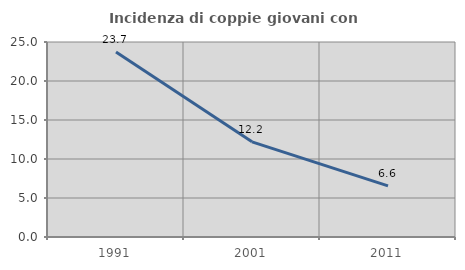
| Category | Incidenza di coppie giovani con figli |
|---|---|
| 1991.0 | 23.724 |
| 2001.0 | 12.204 |
| 2011.0 | 6.556 |